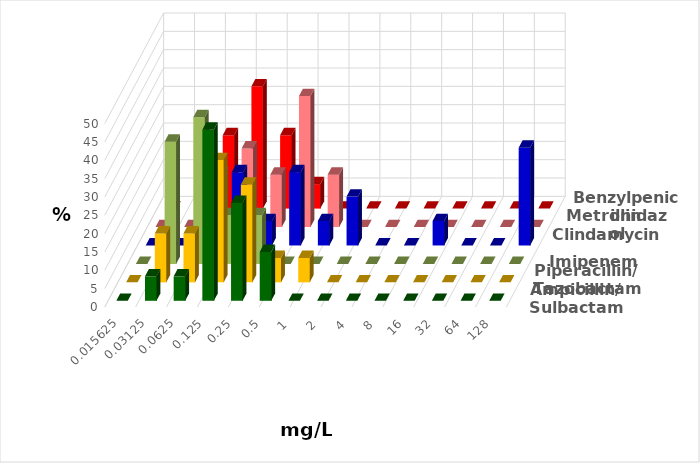
| Category | Ampicillin/ Sulbactam | Piperacillin/ Tazobactam | Imipenem | Clindamycin | Metronidazol | Benzylpenicillin |
|---|---|---|---|---|---|---|
| 0.015625 | 0 | 0 | 0 | 0 | 0 | 0 |
| 0.03125 | 6.667 | 13.333 | 33.333 | 0 | 0 | 20 |
| 0.0625 | 6.667 | 13.333 | 40 | 0 | 14.286 | 20 |
| 0.125 | 46.667 | 33.333 | 13.333 | 20 | 21.429 | 33.333 |
| 0.25 | 26.667 | 26.667 | 13.333 | 6.667 | 14.286 | 20 |
| 0.5 | 13.333 | 6.667 | 0 | 20 | 35.714 | 6.667 |
| 1.0 | 0 | 6.667 | 0 | 6.667 | 14.286 | 0 |
| 2.0 | 0 | 0 | 0 | 13.333 | 0 | 0 |
| 4.0 | 0 | 0 | 0 | 0 | 0 | 0 |
| 8.0 | 0 | 0 | 0 | 0 | 0 | 0 |
| 16.0 | 0 | 0 | 0 | 6.667 | 0 | 0 |
| 32.0 | 0 | 0 | 0 | 0 | 0 | 0 |
| 64.0 | 0 | 0 | 0 | 0 | 0 | 0 |
| 128.0 | 0 | 0 | 0 | 26.667 | 0 | 0 |